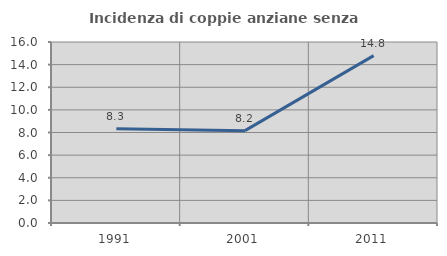
| Category | Incidenza di coppie anziane senza figli  |
|---|---|
| 1991.0 | 8.333 |
| 2001.0 | 8.163 |
| 2011.0 | 14.793 |